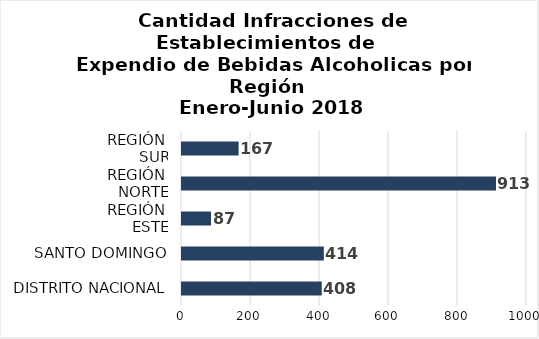
| Category | Series 0 |
|---|---|
| DISTRITO NACIONAL | 408 |
| SANTO DOMINGO | 414 |
| REGIÓN 
ESTE | 87 |
| REGIÓN 
NORTE | 913 |
| REGIÓN 
SUR | 167 |